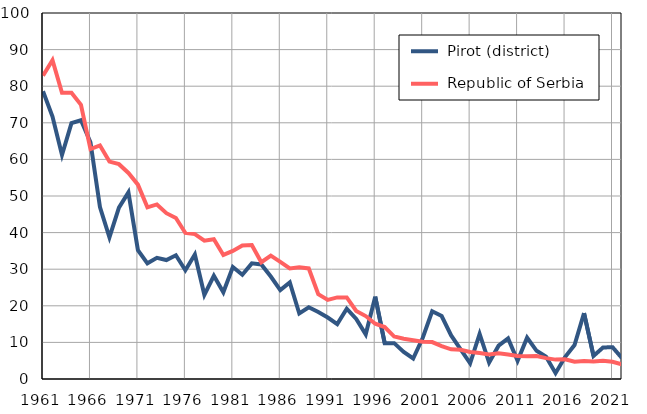
| Category |  Pirot (district) |  Republic of Serbia |
|---|---|---|
| 1961.0 | 78.6 | 82.9 |
| 1962.0 | 71.7 | 87.1 |
| 1963.0 | 61.2 | 78.2 |
| 1964.0 | 69.9 | 78.2 |
| 1965.0 | 70.7 | 74.9 |
| 1966.0 | 64.7 | 62.8 |
| 1967.0 | 47 | 63.8 |
| 1968.0 | 38.7 | 59.4 |
| 1969.0 | 46.8 | 58.7 |
| 1970.0 | 51 | 56.3 |
| 1971.0 | 35.2 | 53.1 |
| 1972.0 | 31.6 | 46.9 |
| 1973.0 | 33.1 | 47.7 |
| 1974.0 | 32.5 | 45.3 |
| 1975.0 | 33.8 | 44 |
| 1976.0 | 29.7 | 39.9 |
| 1977.0 | 34 | 39.6 |
| 1978.0 | 23 | 37.8 |
| 1979.0 | 28.2 | 38.2 |
| 1980.0 | 23.7 | 33.9 |
| 1981.0 | 30.6 | 35 |
| 1982.0 | 28.5 | 36.5 |
| 1983.0 | 31.6 | 36.6 |
| 1984.0 | 31.3 | 31.9 |
| 1985.0 | 28 | 33.7 |
| 1986.0 | 24.3 | 32 |
| 1987.0 | 26.4 | 30.2 |
| 1988.0 | 17.9 | 30.5 |
| 1989.0 | 19.6 | 30.2 |
| 1990.0 | 18.3 | 23.2 |
| 1991.0 | 16.8 | 21.6 |
| 1992.0 | 15 | 22.3 |
| 1993.0 | 19.2 | 22.3 |
| 1994.0 | 16.4 | 18.6 |
| 1995.0 | 12.2 | 17.2 |
| 1996.0 | 22.5 | 15.1 |
| 1997.0 | 9.8 | 14.2 |
| 1998.0 | 9.8 | 11.6 |
| 1999.0 | 7.4 | 11 |
| 2000.0 | 5.6 | 10.6 |
| 2001.0 | 11.2 | 10.2 |
| 2002.0 | 18.5 | 10.1 |
| 2003.0 | 17.2 | 9 |
| 2004.0 | 11.9 | 8.1 |
| 2005.0 | 8.1 | 8 |
| 2006.0 | 4.3 | 7.4 |
| 2007.0 | 12.3 | 7.1 |
| 2008.0 | 4.5 | 6.7 |
| 2009.0 | 9.1 | 7 |
| 2010.0 | 11.1 | 6.7 |
| 2011.0 | 5 | 6.3 |
| 2012.0 | 11.3 | 6.2 |
| 2013.0 | 7.7 | 6.3 |
| 2014.0 | 6.1 | 5.7 |
| 2015.0 | 1.6 | 5.3 |
| 2016.0 | 6 | 5.4 |
| 2017.0 | 9.3 | 4.7 |
| 2018.0 | 18 | 4.9 |
| 2019.0 | 6.3 | 4.8 |
| 2020.0 | 8.6 | 5 |
| 2021.0 | 8.7 | 4.7 |
| 2022.0 | 5.7 | 4 |